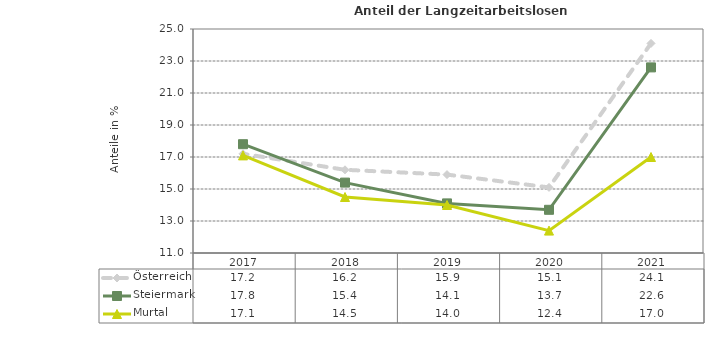
| Category | Österreich | Steiermark | Murtal |
|---|---|---|---|
| 2021.0 | 24.1 | 22.6 | 17 |
| 2020.0 | 15.1 | 13.7 | 12.4 |
| 2019.0 | 15.9 | 14.1 | 14 |
| 2018.0 | 16.2 | 15.4 | 14.5 |
| 2017.0 | 17.2 | 17.8 | 17.1 |